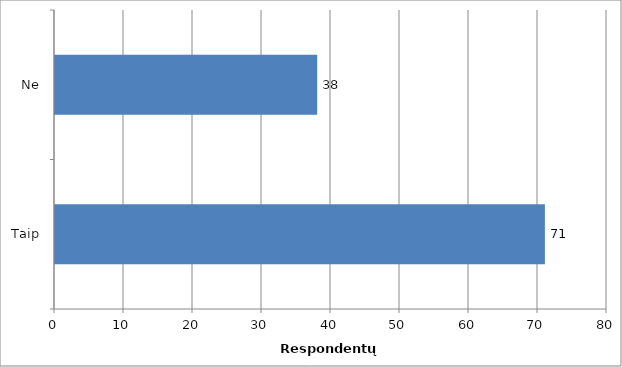
| Category | Series 0 |
|---|---|
| Taip | 71 |
| Ne | 38 |